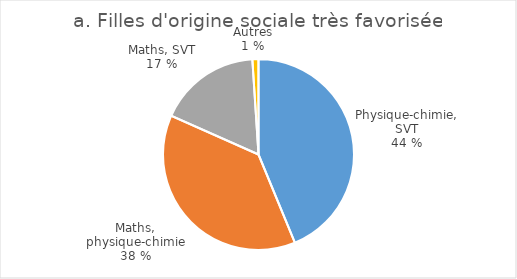
| Category | Filles d'origine sociale très favorisée |
|---|---|
| Physique-chimie, SVT | 10371 |
| Mathématiques, physique-chimie | 8975 |
| Mathématiques, SVT | 4103 |
| Autres | 244 |